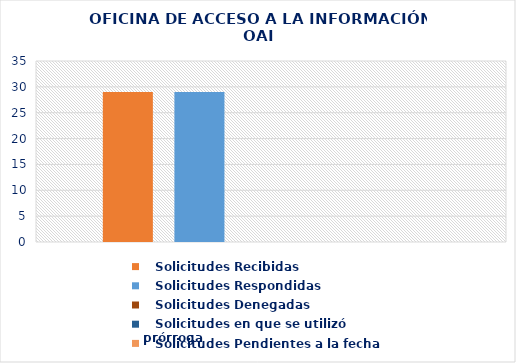
| Category |    Solicitudes Recibidas |    Solicitudes Respondidas |    Solicitudes Denegadas |    Solicitudes en que se utilizó prórroga |    Solicitudes Pendientes a la fecha |
|---|---|---|---|---|---|
| 0 | 29 | 29 | 0 | 0 | 0 |